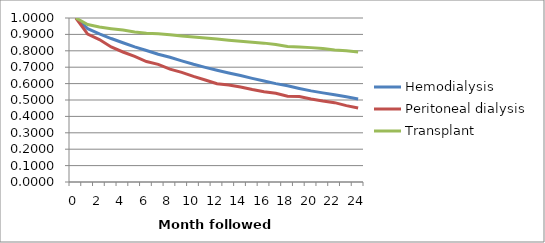
| Category | Hemodialysis | Peritoneal dialysis | Transplant |
|---|---|---|---|
| 0.0 | 1 | 1 | 1 |
| 1.0 | 0.935 | 0.902 | 0.96 |
| 2.0 | 0.903 | 0.868 | 0.945 |
| 3.0 | 0.875 | 0.823 | 0.935 |
| 4.0 | 0.849 | 0.793 | 0.926 |
| 5.0 | 0.824 | 0.766 | 0.915 |
| 6.0 | 0.802 | 0.734 | 0.907 |
| 7.0 | 0.779 | 0.717 | 0.904 |
| 8.0 | 0.76 | 0.688 | 0.897 |
| 9.0 | 0.739 | 0.668 | 0.89 |
| 10.0 | 0.718 | 0.644 | 0.884 |
| 11.0 | 0.699 | 0.622 | 0.877 |
| 12.0 | 0.681 | 0.599 | 0.872 |
| 13.0 | 0.665 | 0.591 | 0.864 |
| 14.0 | 0.649 | 0.579 | 0.858 |
| 15.0 | 0.632 | 0.564 | 0.852 |
| 16.0 | 0.616 | 0.55 | 0.847 |
| 17.0 | 0.6 | 0.541 | 0.839 |
| 18.0 | 0.586 | 0.523 | 0.827 |
| 19.0 | 0.57 | 0.521 | 0.824 |
| 20.0 | 0.556 | 0.506 | 0.819 |
| 21.0 | 0.544 | 0.494 | 0.813 |
| 22.0 | 0.532 | 0.484 | 0.805 |
| 23.0 | 0.52 | 0.466 | 0.8 |
| 24.0 | 0.507 | 0.451 | 0.793 |